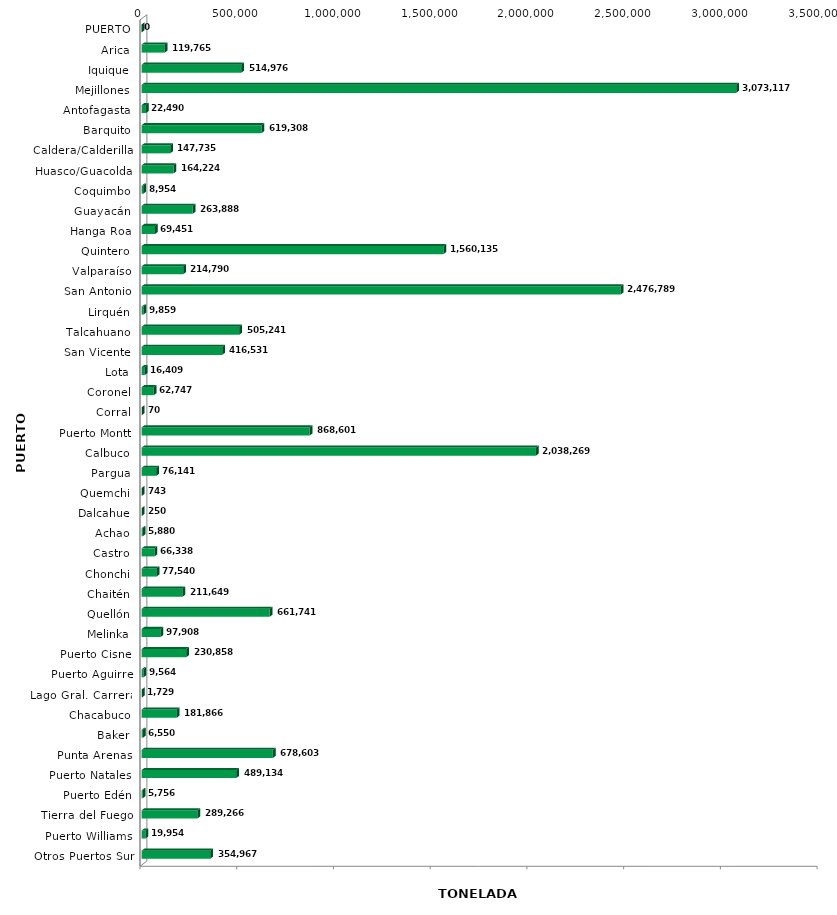
| Category | Series 0 |
|---|---|
| PUERTO | 0 |
| Arica | 119764.748 |
| Iquique | 514975.974 |
| Mejillones | 3073117.16 |
| Antofagasta | 22490.052 |
| Barquito | 619307.988 |
| Caldera/Calderilla | 147735.395 |
| Huasco/Guacolda | 164224 |
| Coquimbo | 8954 |
| Guayacán | 263887.845 |
| Hanga Roa | 69450.95 |
| Quintero | 1560134.664 |
| Valparaíso | 214789.872 |
| San Antonio | 2476789.33 |
| Lirquén | 9858.979 |
| Talcahuano | 505241.397 |
| San Vicente | 416530.764 |
| Lota | 16409 |
| Coronel | 62746.642 |
| Corral | 70 |
| Puerto Montt | 868601.05 |
| Calbuco | 2038268.61 |
| Pargua | 76140.75 |
| Quemchi | 743 |
| Dalcahue | 250 |
| Achao | 5880 |
| Castro | 66338 |
| Chonchi | 77540.033 |
| Chaitén | 211649 |
| Quellón | 661740.7 |
| Melinka | 97908 |
| Puerto Cisne | 230858 |
| Puerto Aguirre | 9564.445 |
| Lago Gral. Carrera | 1729 |
| Chacabuco | 181866.331 |
| Baker | 6550 |
| Punta Arenas | 678603.004 |
| Puerto Natales | 489134 |
| Puerto Edén | 5756 |
| Tierra del Fuego | 289266 |
| Puerto Williams | 19954 |
| Otros Puertos Sur | 354966.85 |